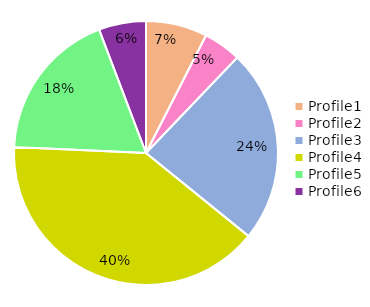
| Category | Series 0 |
|---|---|
| Profile1 | 13 |
| Profile2 | 8 |
| Profile3 | 41 |
| Profile4 | 69 |
| Profile5 | 32 |
| Profile6 | 10 |